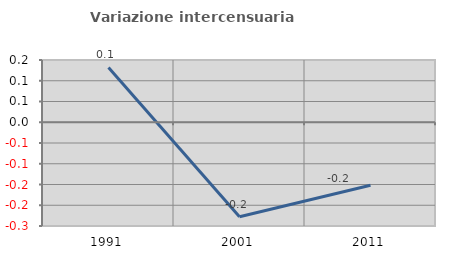
| Category | Variazione intercensuaria annua |
|---|---|
| 1991.0 | 0.132 |
| 2001.0 | -0.228 |
| 2011.0 | -0.152 |